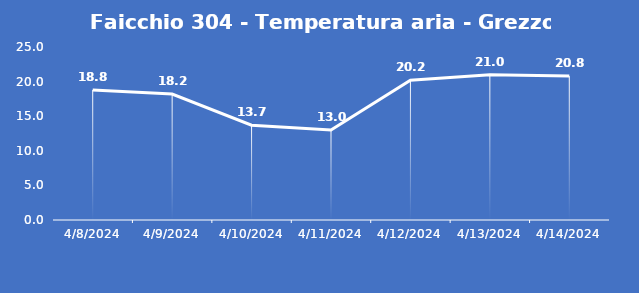
| Category | Faicchio 304 - Temperatura aria - Grezzo (°C) |
|---|---|
| 4/8/24 | 18.8 |
| 4/9/24 | 18.2 |
| 4/10/24 | 13.7 |
| 4/11/24 | 13 |
| 4/12/24 | 20.2 |
| 4/13/24 | 21 |
| 4/14/24 | 20.8 |